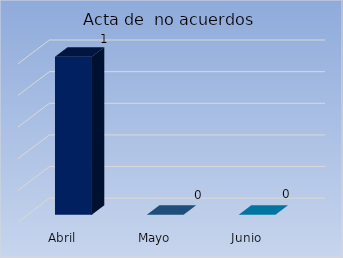
| Category | Acta de  no acuerdos |
|---|---|
| Abril | 1 |
| Mayo | 0 |
| Junio | 0 |